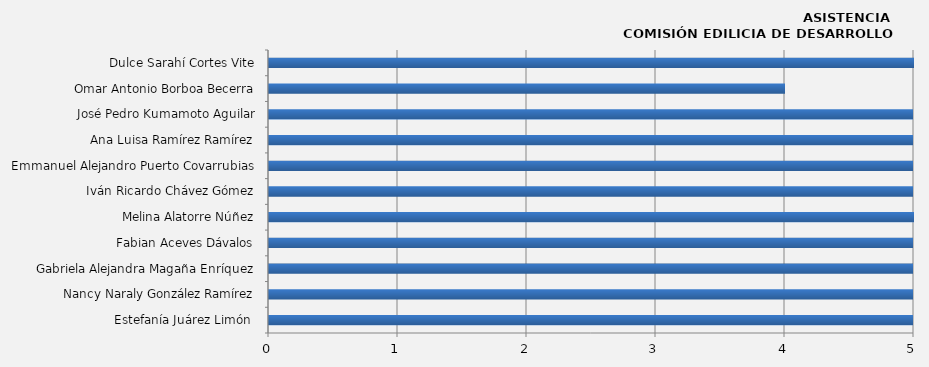
| Category | Estefanía Juárez Limón  |
|---|---|
| Estefanía Juárez Limón  | 7 |
| Nancy Naraly González Ramírez | 7 |
| Gabriela Alejandra Magaña Enríquez | 7 |
| Fabian Aceves Dávalos | 7 |
| Melina Alatorre Núñez | 5 |
| Iván Ricardo Chávez Gómez | 6 |
| Emmanuel Alejandro Puerto Covarrubias | 6 |
| Ana Luisa Ramírez Ramírez | 7 |
| José Pedro Kumamoto Aguilar | 6 |
| Omar Antonio Borboa Becerra | 4 |
| Dulce Sarahí Cortes Vite | 5 |